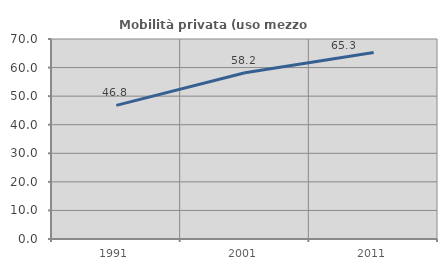
| Category | Mobilità privata (uso mezzo privato) |
|---|---|
| 1991.0 | 46.779 |
| 2001.0 | 58.177 |
| 2011.0 | 65.293 |